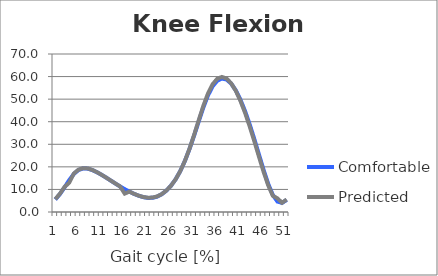
| Category | Comfortable | Predicted |
|---|---|---|
| 0 | 5.554 | 5.682 |
| 1 | 7.941 | 8.116 |
| 2 | 10.922 | 11.11 |
| 3 | 14.122 | 12.971 |
| 4 | 16.856 | 17.048 |
| 5 | 18.589 | 18.75 |
| 6 | 19.294 | 19.432 |
| 7 | 19.196 | 19.305 |
| 8 | 18.567 | 18.637 |
| 9 | 17.616 | 17.652 |
| 10 | 16.472 | 16.487 |
| 11 | 15.215 | 15.224 |
| 12 | 13.902 | 13.913 |
| 13 | 12.589 | 12.599 |
| 14 | 11.318 | 11.321 |
| 15 | 10.12 | 8.148 |
| 16 | 9.027 | 9.024 |
| 17 | 8.046 | 8.057 |
| 18 | 7.216 | 7.251 |
| 19 | 6.585 | 6.652 |
| 20 | 6.24 | 6.335 |
| 21 | 6.28 | 6.388 |
| 22 | 6.803 | 6.9 |
| 23 | 7.861 | 7.929 |
| 24 | 9.466 | 9.501 |
| 25 | 11.642 | 11.651 |
| 26 | 14.476 | 14.471 |
| 27 | 18.097 | 18.096 |
| 28 | 22.591 | 22.625 |
| 29 | 27.91 | 28.043 |
| 30 | 33.876 | 34.186 |
| 31 | 40.192 | 40.711 |
| 32 | 46.349 | 47.06 |
| 33 | 51.692 | 52.543 |
| 34 | 55.701 | 56.614 |
| 35 | 58.172 | 59.041 |
| 36 | 59.132 | 59.84 |
| 37 | 58.684 | 59.128 |
| 38 | 56.908 | 57.031 |
| 39 | 53.899 | 53.69 |
| 40 | 49.781 | 49.279 |
| 41 | 44.704 | 43.973 |
| 42 | 38.833 | 37.947 |
| 43 | 32.354 | 31.399 |
| 44 | 25.516 | 24.584 |
| 45 | 18.71 | 17.885 |
| 46 | 12.491 | 11.856 |
| 47 | 7.57 | 7.188 |
| 48 | 4.639 | 6.042 |
| 49 | 4.026 | 4.096 |
| 50 | 5.372 | 5.53 |